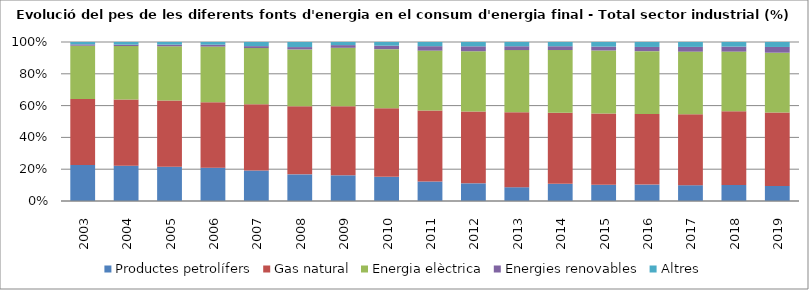
| Category | Productes petrolífers | Gas natural | Energia elèctrica | Energies renovables | Altres |
|---|---|---|---|---|---|
| 2003.0 | 1115.86 | 2046.24 | 1648.73 | 41.74 | 73.3 |
| 2004.0 | 1094.84 | 2057.53 | 1655.67 | 44.86 | 81 |
| 2005.0 | 1072.81 | 2079.07 | 1694.72 | 51.98 | 82.26 |
| 2006.0 | 1025.16 | 2011.58 | 1712.37 | 58.36 | 82.42 |
| 2007.0 | 932.24 | 2023.66 | 1716.94 | 59.42 | 126.33 |
| 2008.0 | 750.83 | 1919.24 | 1603.29 | 66.14 | 143.5 |
| 2009.0 | 617.88 | 1659.01 | 1406.86 | 64.43 | 74.93 |
| 2010.0 | 591.76 | 1678.78 | 1451.36 | 85.46 | 89.75 |
| 2011.0 | 470.2 | 1712.24 | 1445.99 | 106.46 | 101.29 |
| 2012.0 | 411.34 | 1672.35 | 1403.97 | 114.09 | 100.72 |
| 2013.0 | 300.04 | 1632.76 | 1351.94 | 82.82 | 92.99 |
| 2014.0 | 379.08 | 1570.69 | 1383.67 | 83.37 | 94.05 |
| 2015.0 | 364.1 | 1600.84 | 1414.9 | 87.34 | 103.37 |
| 2016.0 | 373.34 | 1604.25 | 1427.54 | 95.43 | 112.33 |
| 2017.0 | 370.62 | 1664.09 | 1471.91 | 110.89 | 115.05 |
| 2018.0 | 372.72 | 1706.86 | 1382.15 | 115.66 | 106.84 |
| 2019.0 | 347.51 | 1695 | 1382 | 132.5 | 114.62 |